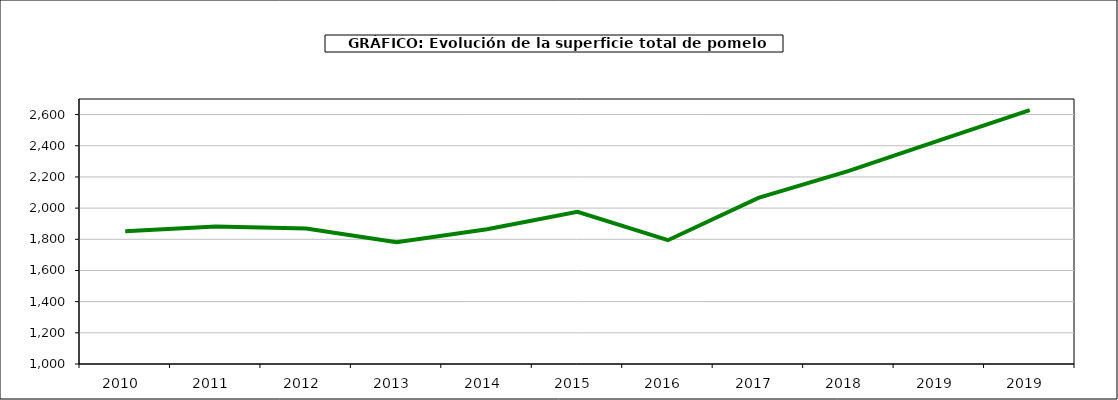
| Category | superficie |
|---|---|
| 2010.0 | 1851 |
| 2011.0 | 1882 |
| 2012.0 | 1869 |
| 2013.0 | 1781 |
| 2014.0 | 1864 |
| 2015.0 | 1976 |
| 2016.0 | 1794 |
| 2017.0 | 2066 |
| 2018.0 | 2239 |
| 2019.0 | 2434 |
| 2019.0 | 2628 |